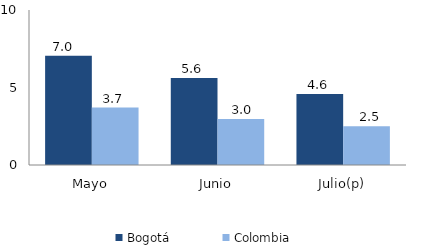
| Category | Bogotá | Colombia |
|---|---|---|
| Mayo | 7.045 | 3.709 |
| Junio | 5.618 | 2.968 |
| Julio(p) | 4.587 | 2.501 |